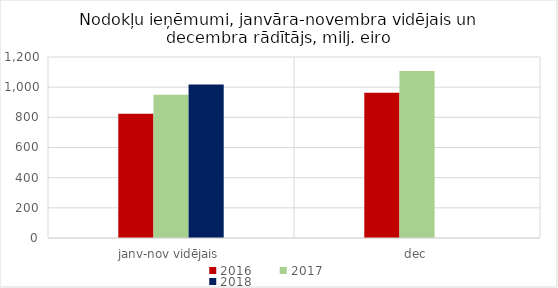
| Category | 2016 | 2017 | 2018 |
|---|---|---|---|
| janv-nov vidējais | 824369.827 | 949988.056 | 1017701.506 |
| dec | 962936.043 | 1107409.079 | 0 |